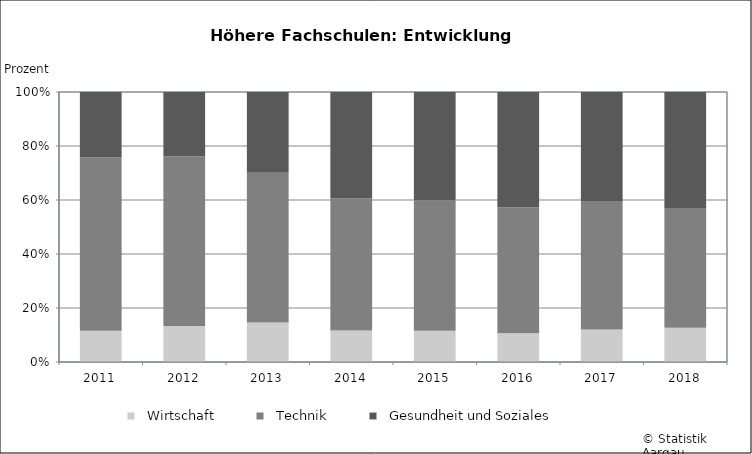
| Category |   Wirtschaft |   Technik |   Gesundheit und Soziales |
|---|---|---|---|
| 2011 | 72 | 398 | 150 |
| 2012 | 86 | 405 | 153 |
| 2013 | 99 | 376 | 203 |
| 2014 | 89 | 374 | 302 |
| 2015 | 95 | 398 | 330 |
| 2016 | 84 | 368 | 337 |
| 2017 | 95 | 376 | 319 |
| 2018 | 110 | 386 | 373 |